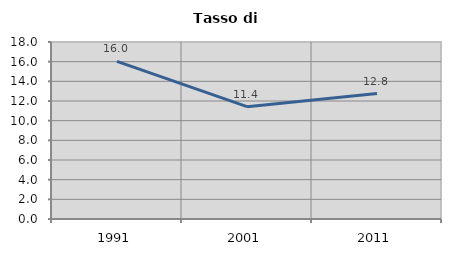
| Category | Tasso di disoccupazione   |
|---|---|
| 1991.0 | 16.034 |
| 2001.0 | 11.421 |
| 2011.0 | 12.759 |